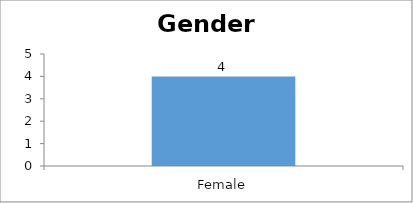
| Category | Gender |
|---|---|
| Female | 4 |